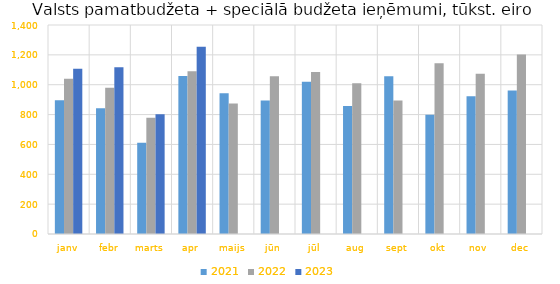
| Category | 2021 | 2022 | 2023 |
|---|---|---|---|
| janv | 895228.16 | 1040582.151 | 1106694.936 |
| febr | 841554.321 | 979083.527 | 1117281.777 |
| marts | 610601.687 | 778451.361 | 802572.118 |
| apr | 1058636.045 | 1089522.586 | 1254540.122 |
| maijs | 942788.526 | 873781.393 | 0 |
| jūn | 894159.676 | 1056226.576 | 0 |
| jūl | 1019598.16 | 1084656.571 | 0 |
| aug | 856870.053 | 1009449.844 | 0 |
| sept | 1056590.029 | 894284.855 | 0 |
| okt | 799251.823 | 1144151.024 | 0 |
| nov | 922897.393 | 1072959.66 | 0 |
| dec | 961417.995 | 1201924.058 | 0 |